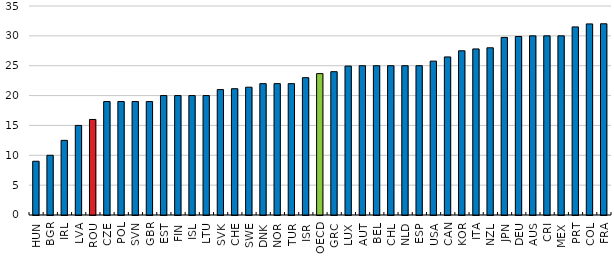
| Category | Series 0 |
|---|---|
| HUN | 9 |
| BGR | 10 |
| IRL | 12.5 |
| LVA | 15 |
| ROU | 16 |
| CZE | 19 |
| POL | 19 |
| SVN | 19 |
| GBR | 19 |
| EST | 20 |
| FIN | 20 |
| ISL | 20 |
| LTU | 20 |
| SVK | 21 |
| CHE | 21.149 |
| SWE | 21.4 |
| DNK | 22 |
| NOR | 22 |
| TUR | 22 |
| ISR | 23 |
| OECD | 23.676 |
| GRC | 24 |
| LUX | 24.94 |
| AUT | 25 |
| BEL | 25 |
| CHL | 25 |
| NLD | 25 |
| ESP | 25 |
| USA | 25.767 |
| CAN | 26.47 |
| KOR | 27.5 |
| ITA | 27.81 |
| NZL | 28 |
| JPN | 29.74 |
| DEU | 29.897 |
| AUS | 30 |
| CRI | 30 |
| MEX | 30 |
| PRT | 31.5 |
| COL | 32 |
| FRA | 32.02 |